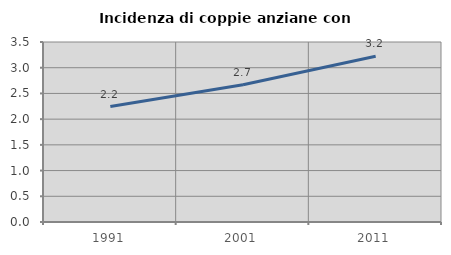
| Category | Incidenza di coppie anziane con figli |
|---|---|
| 1991.0 | 2.244 |
| 2001.0 | 2.667 |
| 2011.0 | 3.221 |